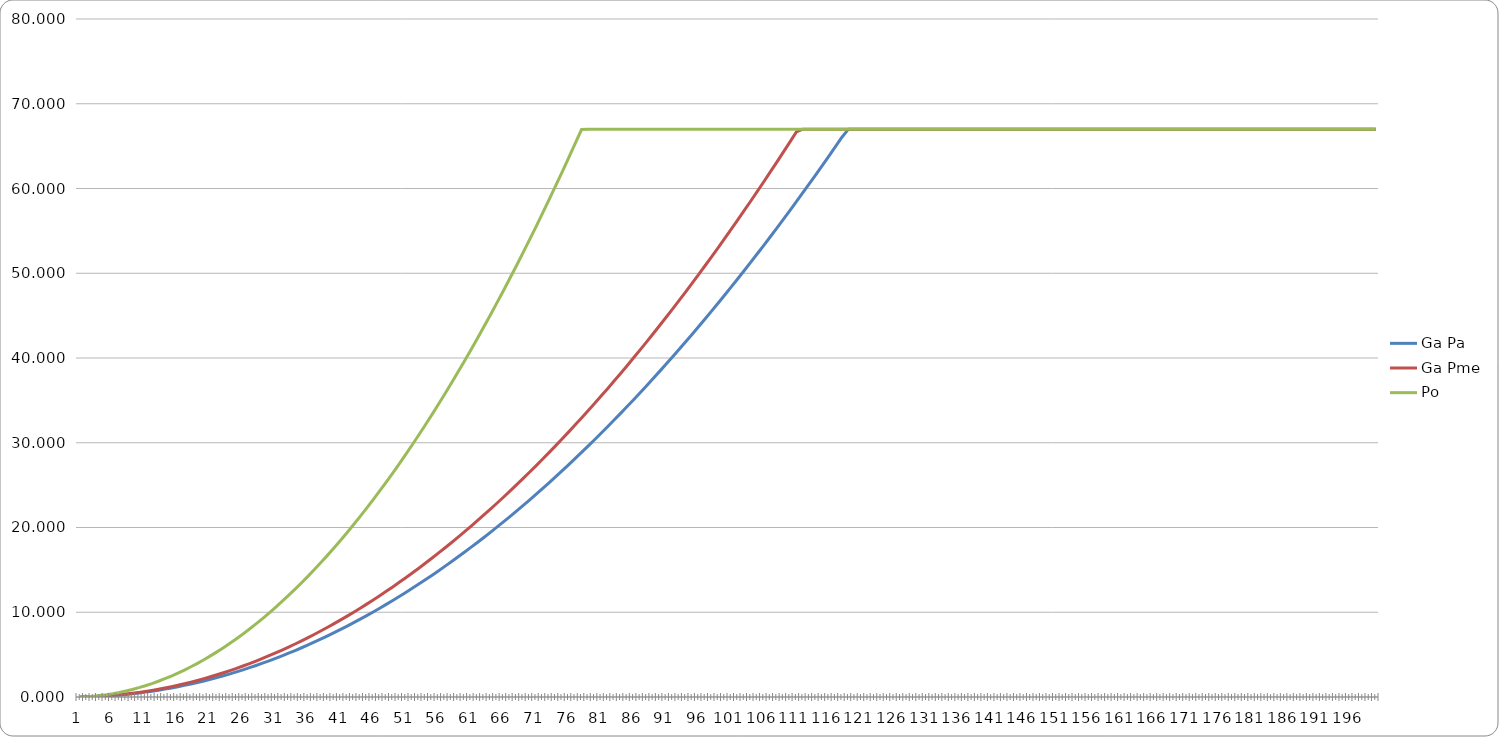
| Category | Ga Pa | Ga Pme | Po |
|---|---|---|---|
| 0 | 0.005 | 0.005 | 0.011 |
| 1 | 0.019 | 0.022 | 0.044 |
| 2 | 0.043 | 0.049 | 0.099 |
| 3 | 0.076 | 0.087 | 0.176 |
| 4 | 0.119 | 0.135 | 0.275 |
| 5 | 0.171 | 0.195 | 0.396 |
| 6 | 0.232 | 0.265 | 0.539 |
| 7 | 0.304 | 0.346 | 0.704 |
| 8 | 0.384 | 0.438 | 0.891 |
| 9 | 0.474 | 0.541 | 1.101 |
| 10 | 0.574 | 0.655 | 1.332 |
| 11 | 0.683 | 0.779 | 1.585 |
| 12 | 0.802 | 0.914 | 1.86 |
| 13 | 0.93 | 1.061 | 2.157 |
| 14 | 1.067 | 1.218 | 2.476 |
| 15 | 1.214 | 1.385 | 2.818 |
| 16 | 1.371 | 1.564 | 3.181 |
| 17 | 1.537 | 1.753 | 3.566 |
| 18 | 1.712 | 1.953 | 3.973 |
| 19 | 1.897 | 2.164 | 4.402 |
| 20 | 2.092 | 2.386 | 4.854 |
| 21 | 2.296 | 2.619 | 5.327 |
| 22 | 2.509 | 2.862 | 5.822 |
| 23 | 2.732 | 3.117 | 6.339 |
| 24 | 2.965 | 3.382 | 6.879 |
| 25 | 3.207 | 3.658 | 7.44 |
| 26 | 3.458 | 3.945 | 8.023 |
| 27 | 3.719 | 4.242 | 8.629 |
| 28 | 3.989 | 4.551 | 9.256 |
| 29 | 4.269 | 4.87 | 9.905 |
| 30 | 4.558 | 5.2 | 10.577 |
| 31 | 4.857 | 5.541 | 11.27 |
| 32 | 5.166 | 5.893 | 11.986 |
| 33 | 5.483 | 6.255 | 12.723 |
| 34 | 5.811 | 6.629 | 13.482 |
| 35 | 6.147 | 7.013 | 14.264 |
| 36 | 6.494 | 7.408 | 15.067 |
| 37 | 6.849 | 7.814 | 15.893 |
| 38 | 7.215 | 8.23 | 16.74 |
| 39 | 7.589 | 8.658 | 17.61 |
| 40 | 7.974 | 9.096 | 18.501 |
| 41 | 8.367 | 9.545 | 19.415 |
| 42 | 8.771 | 10.005 | 20.35 |
| 43 | 9.183 | 10.476 | 21.308 |
| 44 | 9.605 | 10.958 | 22.287 |
| 45 | 10.037 | 11.45 | 23.289 |
| 46 | 10.478 | 11.953 | 24.312 |
| 47 | 10.929 | 12.467 | 25.358 |
| 48 | 11.389 | 12.992 | 26.425 |
| 49 | 11.859 | 13.528 | 27.515 |
| 50 | 12.338 | 14.074 | 28.627 |
| 51 | 12.826 | 14.632 | 29.76 |
| 52 | 13.324 | 15.2 | 30.916 |
| 53 | 13.832 | 15.779 | 32.093 |
| 54 | 14.349 | 16.369 | 33.293 |
| 55 | 14.875 | 16.969 | 34.515 |
| 56 | 15.411 | 17.581 | 35.758 |
| 57 | 15.957 | 18.203 | 37.024 |
| 58 | 16.512 | 18.836 | 38.312 |
| 59 | 17.076 | 19.48 | 39.622 |
| 60 | 17.65 | 20.135 | 40.953 |
| 61 | 18.234 | 20.8 | 42.307 |
| 62 | 18.827 | 21.477 | 43.683 |
| 63 | 19.429 | 22.164 | 45.08 |
| 64 | 20.041 | 22.862 | 46.5 |
| 65 | 20.662 | 23.571 | 47.942 |
| 66 | 21.293 | 24.291 | 49.406 |
| 67 | 21.934 | 25.021 | 50.892 |
| 68 | 22.583 | 25.762 | 52.399 |
| 69 | 23.243 | 26.515 | 53.929 |
| 70 | 23.912 | 27.278 | 55.481 |
| 71 | 24.59 | 28.051 | 57.055 |
| 72 | 25.278 | 28.836 | 58.651 |
| 73 | 25.975 | 29.631 | 60.269 |
| 74 | 26.682 | 30.438 | 61.909 |
| 75 | 27.398 | 31.255 | 63.571 |
| 76 | 28.124 | 32.083 | 65.254 |
| 77 | 28.859 | 32.921 | 66.96 |
| 78 | 29.604 | 33.771 | 67 |
| 79 | 30.358 | 34.631 | 67 |
| 80 | 31.122 | 35.502 | 67 |
| 81 | 31.895 | 36.384 | 67 |
| 82 | 32.677 | 37.277 | 67 |
| 83 | 33.47 | 38.181 | 67 |
| 84 | 34.271 | 39.095 | 67 |
| 85 | 35.082 | 40.021 | 67 |
| 86 | 35.903 | 40.957 | 67 |
| 87 | 36.733 | 41.904 | 67 |
| 88 | 37.573 | 42.862 | 67 |
| 89 | 38.422 | 43.83 | 67 |
| 90 | 39.28 | 44.81 | 67 |
| 91 | 40.148 | 45.8 | 67 |
| 92 | 41.026 | 46.801 | 67 |
| 93 | 41.913 | 47.813 | 67 |
| 94 | 42.809 | 48.835 | 67 |
| 95 | 43.715 | 49.869 | 67 |
| 96 | 44.631 | 50.913 | 67 |
| 97 | 45.556 | 51.969 | 67 |
| 98 | 46.49 | 53.035 | 67 |
| 99 | 47.434 | 54.111 | 67 |
| 100 | 48.388 | 55.199 | 67 |
| 101 | 49.351 | 56.297 | 67 |
| 102 | 50.323 | 57.407 | 67 |
| 103 | 51.305 | 58.527 | 67 |
| 104 | 52.296 | 59.658 | 67 |
| 105 | 53.297 | 60.799 | 67 |
| 106 | 54.307 | 61.952 | 67 |
| 107 | 55.327 | 63.115 | 67 |
| 108 | 56.357 | 64.29 | 67 |
| 109 | 57.395 | 65.475 | 67 |
| 110 | 58.444 | 66.671 | 67 |
| 111 | 59.501 | 67 | 67 |
| 112 | 60.569 | 67 | 67 |
| 113 | 61.645 | 67 | 67 |
| 114 | 62.732 | 67 | 67 |
| 115 | 63.827 | 67 | 67 |
| 116 | 64.933 | 67 | 67 |
| 117 | 66.047 | 67 | 67 |
| 118 | 67 | 67 | 67 |
| 119 | 67 | 67 | 67 |
| 120 | 67 | 67 | 67 |
| 121 | 67 | 67 | 67 |
| 122 | 67 | 67 | 67 |
| 123 | 67 | 67 | 67 |
| 124 | 67 | 67 | 67 |
| 125 | 67 | 67 | 67 |
| 126 | 67 | 67 | 67 |
| 127 | 67 | 67 | 67 |
| 128 | 67 | 67 | 67 |
| 129 | 67 | 67 | 67 |
| 130 | 67 | 67 | 67 |
| 131 | 67 | 67 | 67 |
| 132 | 67 | 67 | 67 |
| 133 | 67 | 67 | 67 |
| 134 | 67 | 67 | 67 |
| 135 | 67 | 67 | 67 |
| 136 | 67 | 67 | 67 |
| 137 | 67 | 67 | 67 |
| 138 | 67 | 67 | 67 |
| 139 | 67 | 67 | 67 |
| 140 | 67 | 67 | 67 |
| 141 | 67 | 67 | 67 |
| 142 | 67 | 67 | 67 |
| 143 | 67 | 67 | 67 |
| 144 | 67 | 67 | 67 |
| 145 | 67 | 67 | 67 |
| 146 | 67 | 67 | 67 |
| 147 | 67 | 67 | 67 |
| 148 | 67 | 67 | 67 |
| 149 | 67 | 67 | 67 |
| 150 | 67 | 67 | 67 |
| 151 | 67 | 67 | 67 |
| 152 | 67 | 67 | 67 |
| 153 | 67 | 67 | 67 |
| 154 | 67 | 67 | 67 |
| 155 | 67 | 67 | 67 |
| 156 | 67 | 67 | 67 |
| 157 | 67 | 67 | 67 |
| 158 | 67 | 67 | 67 |
| 159 | 67 | 67 | 67 |
| 160 | 67 | 67 | 67 |
| 161 | 67 | 67 | 67 |
| 162 | 67 | 67 | 67 |
| 163 | 67 | 67 | 67 |
| 164 | 67 | 67 | 67 |
| 165 | 67 | 67 | 67 |
| 166 | 67 | 67 | 67 |
| 167 | 67 | 67 | 67 |
| 168 | 67 | 67 | 67 |
| 169 | 67 | 67 | 67 |
| 170 | 67 | 67 | 67 |
| 171 | 67 | 67 | 67 |
| 172 | 67 | 67 | 67 |
| 173 | 67 | 67 | 67 |
| 174 | 67 | 67 | 67 |
| 175 | 67 | 67 | 67 |
| 176 | 67 | 67 | 67 |
| 177 | 67 | 67 | 67 |
| 178 | 67 | 67 | 67 |
| 179 | 67 | 67 | 67 |
| 180 | 67 | 67 | 67 |
| 181 | 67 | 67 | 67 |
| 182 | 67 | 67 | 67 |
| 183 | 67 | 67 | 67 |
| 184 | 67 | 67 | 67 |
| 185 | 67 | 67 | 67 |
| 186 | 67 | 67 | 67 |
| 187 | 67 | 67 | 67 |
| 188 | 67 | 67 | 67 |
| 189 | 67 | 67 | 67 |
| 190 | 67 | 67 | 67 |
| 191 | 67 | 67 | 67 |
| 192 | 67 | 67 | 67 |
| 193 | 67 | 67 | 67 |
| 194 | 67 | 67 | 67 |
| 195 | 67 | 67 | 67 |
| 196 | 67 | 67 | 67 |
| 197 | 67 | 67 | 67 |
| 198 | 67 | 67 | 67 |
| 199 | 67 | 67 | 67 |